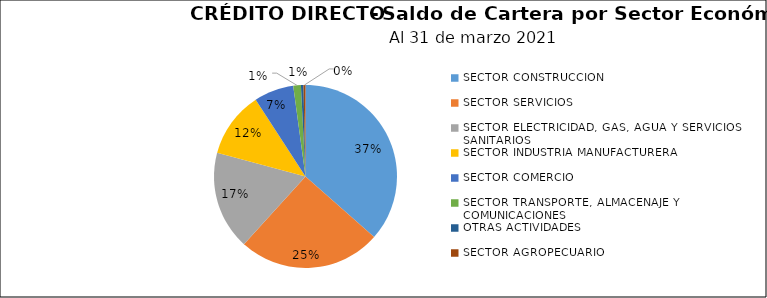
| Category | Saldo | Créditos |
|---|---|---|
| SECTOR CONSTRUCCION | 48.875 | 5 |
| SECTOR SERVICIOS | 33.786 | 24 |
| SECTOR ELECTRICIDAD, GAS, AGUA Y SERVICIOS SANITARIOS | 23.323 | 2 |
| SECTOR INDUSTRIA MANUFACTURERA | 15.623 | 10 |
| SECTOR COMERCIO | 9.389 | 9 |
| SECTOR TRANSPORTE, ALMACENAJE Y COMUNICACIONES | 1.8 | 1 |
| OTRAS ACTIVIDADES | 0.598 | 1 |
| SECTOR AGROPECUARIO | 0.475 | 1 |